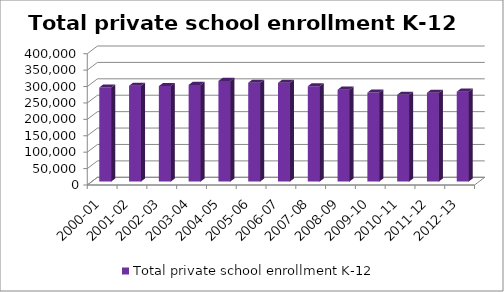
| Category | Total private school enrollment K-12 |
|---|---|
| 2000-01 | 286603 |
| 2001-02 | 291921 |
| 2002-03 | 290729 |
| 2003-04 | 294362 |
| 2004-05 | 306539 |
| 2005-06 | 301100 |
| 2006-07 | 300766 |
| 2007-08 | 290385 |
| 2008-09 | 279873 |
| 2009-10 | 271027 |
| 2010-11 | 264349 |
| 2011-12 | 270551 |
| 2012-13 | 273797 |